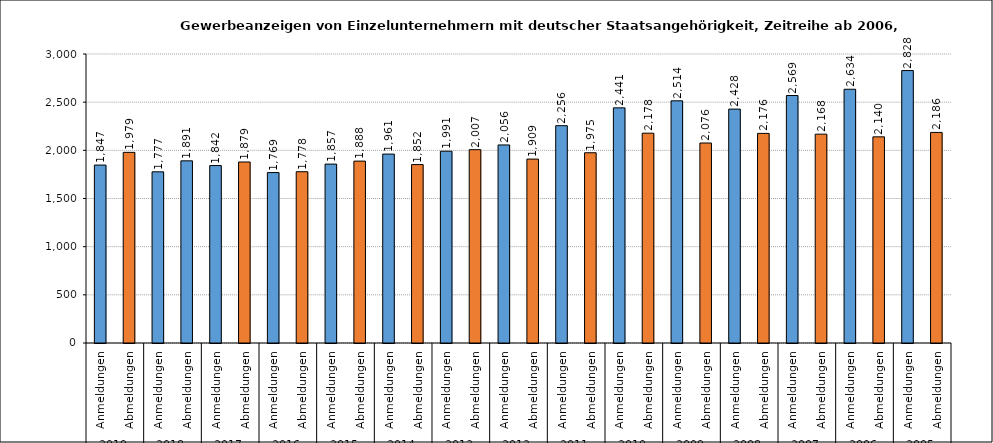
| Category | Series 0 |
|---|---|
| 0 | 1847 |
| 1 | 1979 |
| 2 | 1777 |
| 3 | 1891 |
| 4 | 1842 |
| 5 | 1879 |
| 6 | 1769 |
| 7 | 1778 |
| 8 | 1857 |
| 9 | 1888 |
| 10 | 1961 |
| 11 | 1852 |
| 12 | 1991 |
| 13 | 2007 |
| 14 | 2056 |
| 15 | 1909 |
| 16 | 2256 |
| 17 | 1975 |
| 18 | 2441 |
| 19 | 2178 |
| 20 | 2514 |
| 21 | 2076 |
| 22 | 2428 |
| 23 | 2176 |
| 24 | 2569 |
| 25 | 2168 |
| 26 | 2634 |
| 27 | 2140 |
| 28 | 2828 |
| 29 | 2186 |